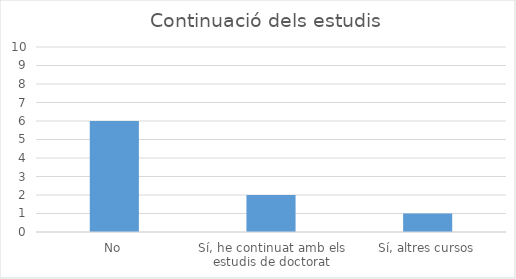
| Category | Series 0 |
|---|---|
| No | 6 |
| Sí, he continuat amb els estudis de doctorat | 2 |
| Sí, altres cursos | 1 |